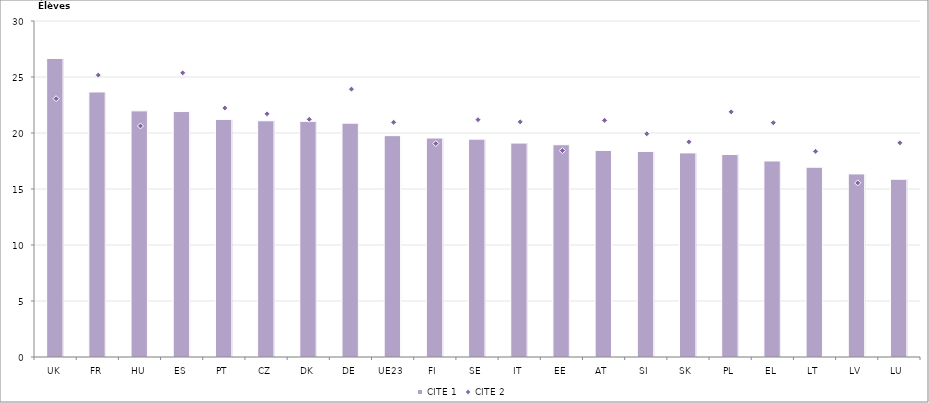
| Category | CITE 1 |
|---|---|
| UK | 26.655 |
| FR | 23.664 |
| HU | 21.977 |
| ES | 21.916 |
| PT | 21.215 |
| CZ | 21.094 |
| DK | 21.039 |
| DE | 20.878 |
| UE23 | 19.763 |
| FI | 19.55 |
| SE | 19.451 |
| IT | 19.101 |
| EE | 18.952 |
| AT | 18.448 |
| SI | 18.352 |
| SK | 18.224 |
| PL | 18.08 |
| EL | 17.503 |
| LT | 16.945 |
| LV | 16.347 |
| LU | 15.869 |